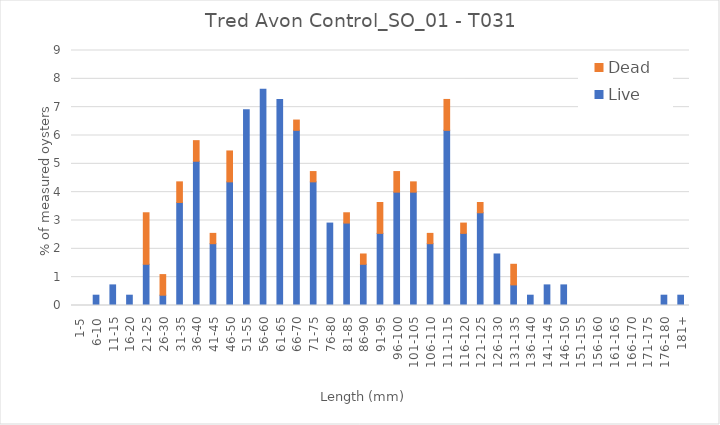
| Category | Live | Dead |
|---|---|---|
| 1-5 | 0 | 0 |
| 6-10 | 0.364 | 0 |
| 11-15 | 0.727 | 0 |
| 16-20 | 0.364 | 0 |
| 21-25 | 1.455 | 1.818 |
| 26-30 | 0.364 | 0.727 |
| 31-35 | 3.636 | 0.727 |
| 36-40 | 5.091 | 0.727 |
| 41-45 | 2.182 | 0.364 |
| 46-50 | 4.364 | 1.091 |
| 51-55 | 6.909 | 0 |
| 56-60 | 7.636 | 0 |
| 61-65 | 7.273 | 0 |
| 66-70 | 6.182 | 0.364 |
| 71-75 | 4.364 | 0.364 |
| 76-80 | 2.909 | 0 |
| 81-85 | 2.909 | 0.364 |
| 86-90 | 1.455 | 0.364 |
| 91-95 | 2.545 | 1.091 |
| 96-100 | 4 | 0.727 |
| 101-105 | 4 | 0.364 |
| 106-110 | 2.182 | 0.364 |
| 111-115 | 6.182 | 1.091 |
| 116-120 | 2.545 | 0.364 |
| 121-125 | 3.273 | 0.364 |
| 126-130 | 1.818 | 0 |
| 131-135 | 0.727 | 0.727 |
| 136-140 | 0.364 | 0 |
| 141-145 | 0.727 | 0 |
| 146-150 | 0.727 | 0 |
| 151-155 | 0 | 0 |
| 156-160 | 0 | 0 |
| 161-165 | 0 | 0 |
| 166-170 | 0 | 0 |
| 171-175 | 0 | 0 |
| 176-180 | 0.364 | 0 |
| 181+ | 0.364 | 0 |